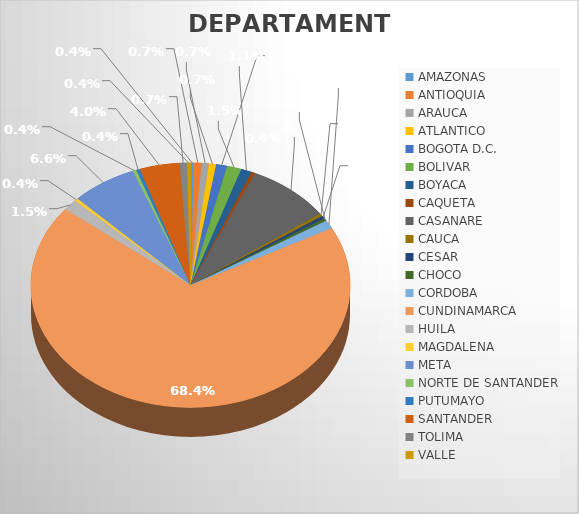
| Category | CANTIDAD |
|---|---|
| AMAZONAS | 1 |
| ANTIOQUIA | 2 |
| ARAUCA | 2 |
| ATLANTICO | 2 |
| BOGOTA D.C. | 3 |
| BOLIVAR | 4 |
| BOYACA | 3 |
| CAQUETA | 1 |
| CASANARE | 23 |
| CAUCA | 1 |
| CESAR | 1 |
| CHOCO | 1 |
| CORDOBA | 3 |
| CUNDINAMARCA | 186 |
| HUILA | 4 |
| MAGDALENA | 1 |
| META | 18 |
| NORTE DE SANTANDER | 1 |
| PUTUMAYO | 1 |
| SANTANDER | 11 |
| TOLIMA | 2 |
| VALLE | 1 |